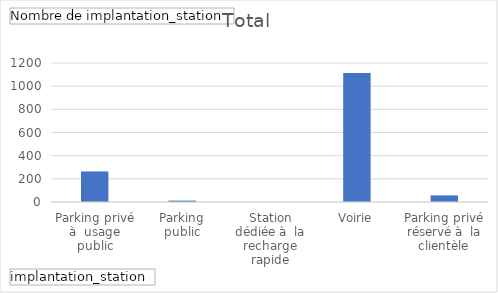
| Category | Total |
|---|---|
| Parking privé à  usage public | 264 |
| Parking public | 12 |
| Station dédiée à  la recharge rapide | 1 |
| Voirie | 1114 |
| Parking privé réservé à  la clientèle | 57 |